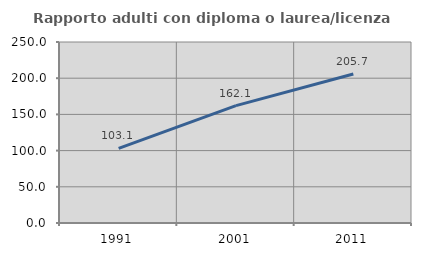
| Category | Rapporto adulti con diploma o laurea/licenza media  |
|---|---|
| 1991.0 | 103.131 |
| 2001.0 | 162.083 |
| 2011.0 | 205.736 |